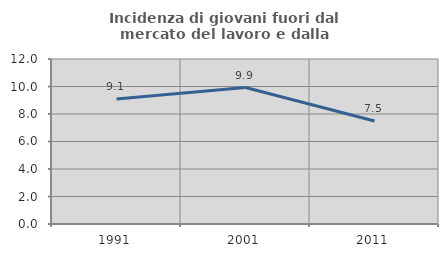
| Category | Incidenza di giovani fuori dal mercato del lavoro e dalla formazione  |
|---|---|
| 1991.0 | 9.091 |
| 2001.0 | 9.926 |
| 2011.0 | 7.494 |